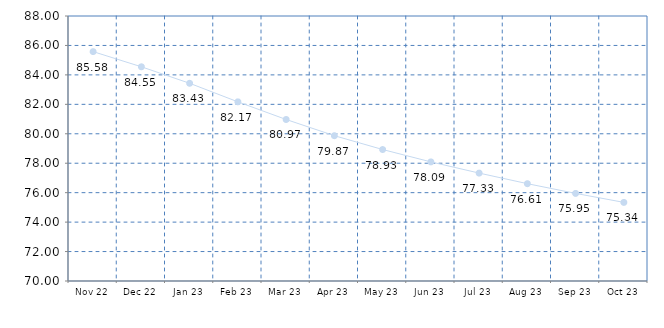
| Category | Series 0 |
|---|---|
| Nov 22 | 85.58 |
| Dec 22 | 84.55 |
| Jan 23 | 83.43 |
| Feb 23 | 82.17 |
| Mar 23 | 80.97 |
| Apr 23 | 79.87 |
| May 23 | 78.93 |
| Jun 23 | 78.09 |
| Jul 23 | 77.33 |
| Aug 23 | 76.61 |
| Sep 23 | 75.95 |
| Oct 23 | 75.34 |